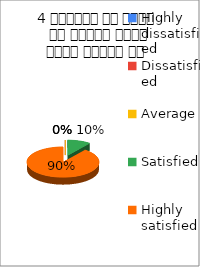
| Category | 4 शिक्षक ने विषय के प्रति रूचि रूचि जागृत की  |
|---|---|
| Highly dissatisfied | 0 |
| Dissatisfied | 0 |
| Average | 0 |
| Satisfied | 3 |
| Highly satisfied | 26 |